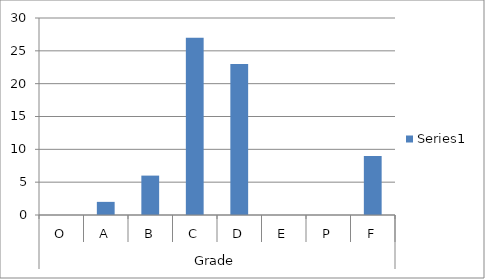
| Category | Series 0 |
|---|---|
| 0 | 0 |
| 1 | 2 |
| 2 | 6 |
| 3 | 27 |
| 4 | 23 |
| 5 | 0 |
| 6 | 0 |
| 7 | 9 |